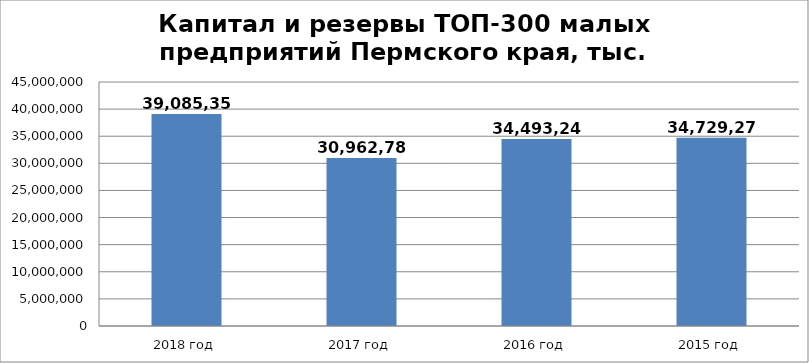
| Category | Series 0 |
|---|---|
| 2018 год | 39085351 |
| 2017 год | 30962783 |
| 2016 год | 34493240 |
| 2015 год | 34729277 |